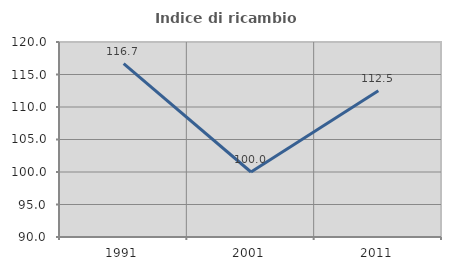
| Category | Indice di ricambio occupazionale  |
|---|---|
| 1991.0 | 116.667 |
| 2001.0 | 100 |
| 2011.0 | 112.5 |